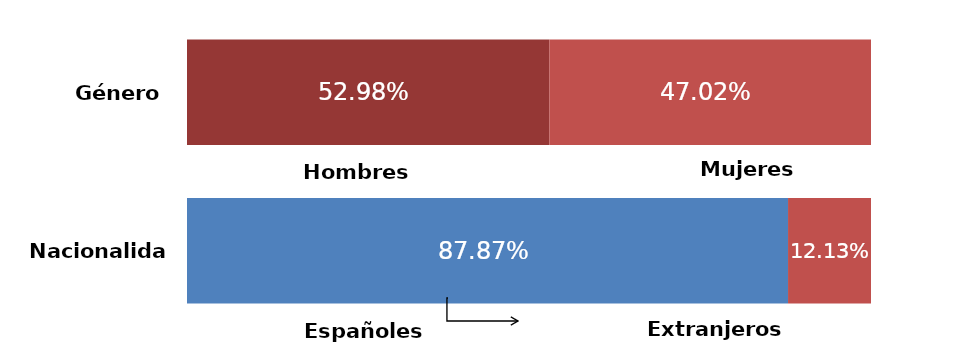
| Category | Series 0 | Series 1 |
|---|---|---|
| 0 | 0.53 | 0.47 |
| 1 | 0.879 | 0.121 |